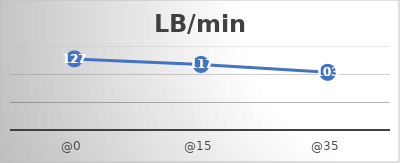
| Category | LB/min |
|---|---|
| @0 | 127 |
| @15 | 117 |
| @35 | 103 |